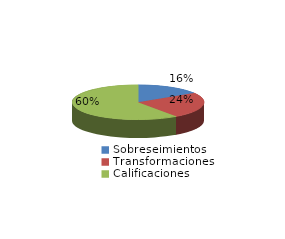
| Category | Series 0 |
|---|---|
| Sobreseimientos | 1292 |
| Transformaciones | 1945 |
| Calificaciones | 4803 |